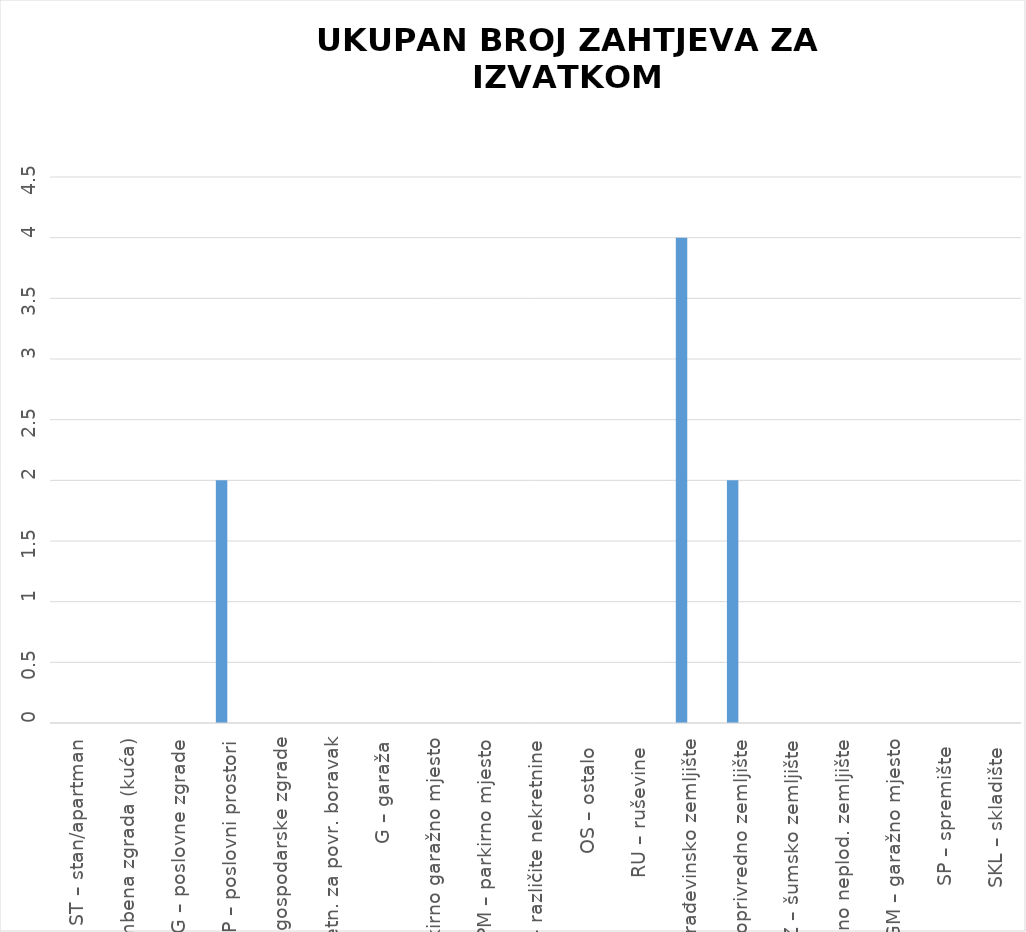
| Category | BROJ ZAPRIMLJENIH ZAHTJEVA KROZ APLIKACIJU eNekretnine | BROJ ZAPRIMLJENIH ZAHTJEVA IZVAN APLIKACIJE
(Popunjava službenik) |
|---|---|---|
| ST – stan/apartman | 0 | 0 |
| OK – stambena zgrada (kuća) | 0 | 0 |
| PZG – poslovne zgrade | 0 | 0 |
| PP – poslovni prostori | 2 | 0 |
| GZG – gospodarske zgrade | 0 | 0 |
| VIK – nekretn. za povr. boravak | 0 | 0 |
| G – garaža | 0 | 0 |
| PGM – parkirno garažno mjesto | 0 | 0 |
| VPM – parkirno mjesto | 0 | 0 |
| RN – različite nekretnine | 0 | 0 |
| OS – ostalo  | 0 | 0 |
| RU – ruševine  | 0 | 0 |
| GZ – građevinsko zemljište | 4 | 0 |
| PZ – poljoprivredno zemljište | 2 | 0 |
| ŠZ – šumsko zemljište | 0 | 0 |
| PNZ – prirodno neplod. zemljište | 0 | 0 |
| GM – garažno mjesto | 0 | 0 |
| SP – spremište  | 0 | 0 |
| SKL – skladište  | 0 | 0 |